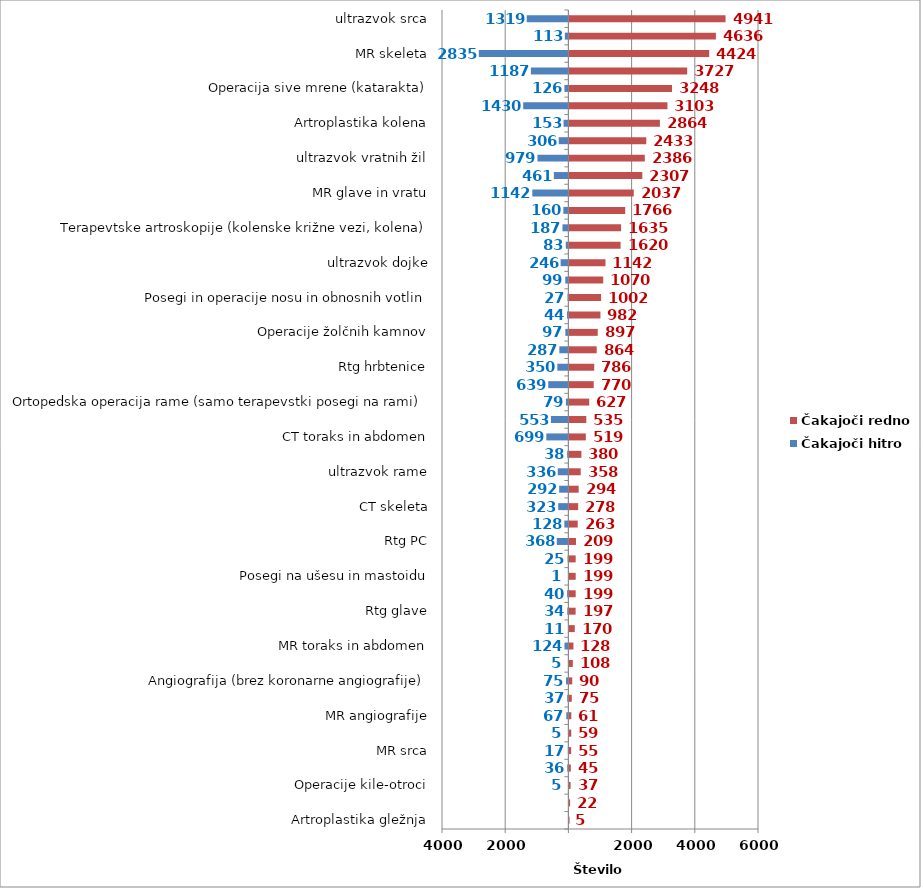
| Category | Čakajoči hitro | Čakajoči redno |
|---|---|---|
| Artroplastika gležnja | 0 | 5 |
| Sklerozacija krčnih žil | 0 | 22 |
| Operacije kile-otroci | -5 | 37 |
| PTA (perkutana transluminalna angioplastika) | -36 | 45 |
| MR srca | -17 | 55 |
| Posegi na arterijah (brez PTA) | -5 | 59 |
| MR angiografije | -67 | 61 |
| CT srca | -37 | 75 |
| Angiografija (brez koronarne angiografije) | -75 | 90 |
| Operacija ščitnice (tudi obščitnice) | -5 | 108 |
| MR toraks in abdomen | -124 | 128 |
| Rtg abdomna | -11 | 170 |
| Rtg glave | -34 | 197 |
| Operacije na odprtem srcu | -40 | 199 |
| Posegi na ušesu in mastoidu | -1 | 199 |
| Rtg ledvic in sečnega mehurja | -25 | 199 |
| Rtg PC | -368 | 209 |
| Elektroencefalografija (EEG) | -128 | 263 |
| CT skeleta | -323 | 278 |
| CT angiografije | -292 | 294 |
| ultrazvok rame | -336 | 358 |
| Drugi posegi na perifernem ožilju | -38 | 380 |
| CT toraks in abdomen | -699 | 519 |
| Koronarna angiografija in PTCA | -553 | 535 |
| Ortopedska operacija rame (samo terapevstki posegi na rami) | -79 | 627 |
| CT glave in vratu | -639 | 770 |
| Rtg hrbtenice | -350 | 786 |
| Rtg mamografija | -287 | 864 |
| Operacije žolčnih kamnov | -97 | 897 |
| Operacija karpalnega kanala | -44 | 982 |
| Posegi in operacije nosu in obnosnih votlin | -27 | 1002 |
| Posegi in operacije hrbtenice | -99 | 1070 |
| ultrazvok dojke | -246 | 1142 |
| Posegi in operacije v ustih, grlu in žrelu | -83 | 1620 |
| Terapevtske artroskopije (kolenske križne vezi, kolena) | -187 | 1635 |
| Operacije kile-odrasli | -160 | 1766 |
| MR glave in vratu | -1142 | 2037 |
| Rtg skletela | -461 | 2307 |
| ultrazvok vratnih žil | -979 | 2386 |
| Artroplastika kolka (protetika, endoproteza) | -306 | 2433 |
| Artroplastika kolena | -153 | 2864 |
| Elektromiografija (EMG) | -1430 | 3103 |
| Operacija sive mrene (katarakta) | -126 | 3248 |
| ultrazvok mehkih tkiv (mišica, tetiva, sklep, skrotum, vrat, kolki novorojenčki) | -1187 | 3727 |
| MR skeleta | -2835 | 4424 |
| Operacije krčnih žil | -113 | 4636 |
| ultrazvok srca | -1319 | 4941 |